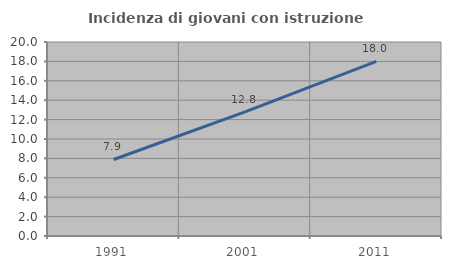
| Category | Incidenza di giovani con istruzione universitaria |
|---|---|
| 1991.0 | 7.887 |
| 2001.0 | 12.804 |
| 2011.0 | 18.012 |